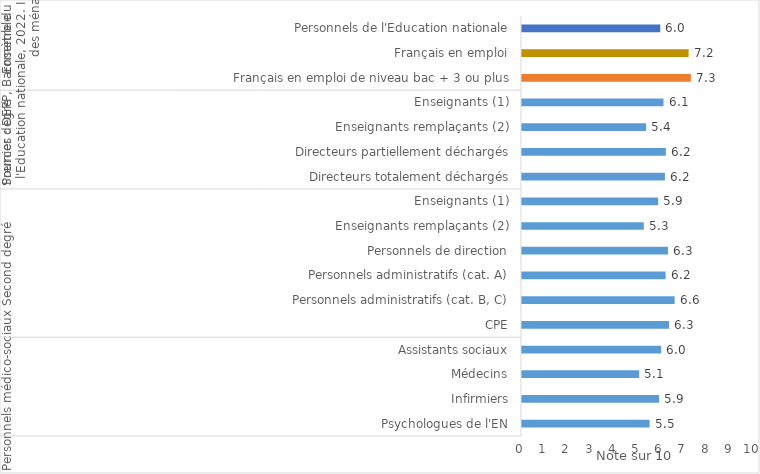
| Category | Dans quelle mesure êtes-vous satisfait(e) de votre travail en général ? |
|---|---|
| 0 | 5.5 |
| 1 | 5.91 |
| 2 | 5.05 |
| 3 | 6 |
| 4 | 6.34 |
| 5 | 6.58 |
| 6 | 6.19 |
| 7 | 6.29 |
| 8 | 5.25 |
| 9 | 5.87 |
| 10 | 6.16 |
| 11 | 6.2 |
| 12 | 5.35 |
| 13 | 6.1 |
| 14 | 7.28 |
| 15 | 7.18 |
| 16 | 5.96 |